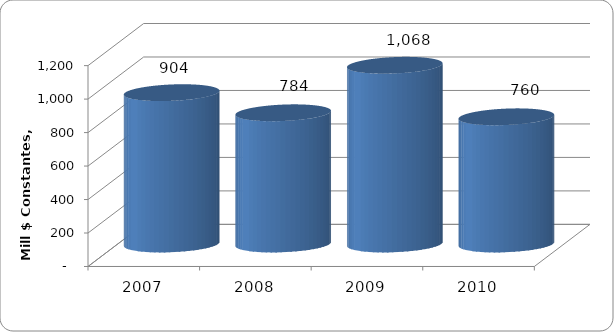
| Category | SALDO DE DEUDA |
|---|---|
| 2007 | 904.172 |
| 2008 | 783.989 |
| 2009 | 1067.81 |
| 2010 | 760 |